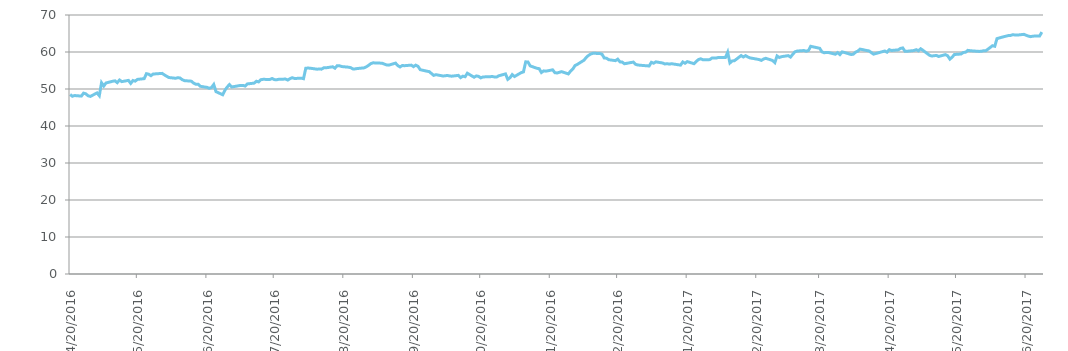
| Category | Series 0 |
|---|---|
| 06/27/2017 | 65.38 |
| 06/26/2017 | 64.35 |
| 06/23/2017 | 64.28 |
| 06/22/2017 | 64.15 |
| 06/21/2017 | 64.29 |
| 06/20/2017 | 64.52 |
| 06/19/2017 | 64.77 |
| 06/16/2017 | 64.57 |
| 06/15/2017 | 64.61 |
| 06/14/2017 | 64.67 |
| 06/13/2017 | 64.46 |
| 06/12/2017 | 64.43 |
| 06/09/2017 | 63.97 |
| 06/08/2017 | 63.79 |
| 06/07/2017 | 63.62 |
| 06/06/2017 | 61.55 |
| 06/05/2017 | 61.7 |
| 06/02/2017 | 60.32 |
| 06/01/2017 | 60.34 |
| 05/31/2017 | 60.19 |
| 05/30/2017 | 60.16 |
| 05/26/2017 | 60.35 |
| 05/25/2017 | 60.44 |
| 05/24/2017 | 59.94 |
| 05/23/2017 | 59.87 |
| 05/22/2017 | 59.46 |
| 05/19/2017 | 59.32 |
| 05/18/2017 | 58.59 |
| 05/17/2017 | 58.07 |
| 05/16/2017 | 59 |
| 05/15/2017 | 59.29 |
| 05/12/2017 | 58.79 |
| 05/11/2017 | 59.07 |
| 05/10/2017 | 59 |
| 05/09/2017 | 58.91 |
| 05/08/2017 | 59.09 |
| 05/05/2017 | 60.46 |
| 05/04/2017 | 60.87 |
| 05/03/2017 | 60.33 |
| 05/02/2017 | 60.62 |
| 05/01/2017 | 60.4 |
| 04/28/2017 | 60.2 |
| 04/27/2017 | 60.21 |
| 04/26/2017 | 61.1 |
| 04/25/2017 | 60.97 |
| 04/24/2017 | 60.58 |
| 04/21/2017 | 60.41 |
| 04/20/2017 | 60.63 |
| 04/19/2017 | 59.95 |
| 04/18/2017 | 60.27 |
| 04/17/2017 | 60.1 |
| 04/13/2017 | 59.42 |
| 04/12/2017 | 59.83 |
| 04/11/2017 | 60.29 |
| 04/10/2017 | 60.4 |
| 04/07/2017 | 60.78 |
| 04/06/2017 | 60.24 |
| 04/05/2017 | 59.97 |
| 04/04/2017 | 59.41 |
| 04/03/2017 | 59.32 |
| 03/31/2017 | 59.87 |
| 03/30/2017 | 60.03 |
| 03/29/2017 | 59.3 |
| 03/28/2017 | 59.83 |
| 03/27/2017 | 59.4 |
| 03/24/2017 | 59.85 |
| 03/23/2017 | 59.87 |
| 03/22/2017 | 59.8 |
| 03/21/2017 | 60.03 |
| 03/20/2017 | 61 |
| 03/17/2017 | 61.4 |
| 03/16/2017 | 61.55 |
| 03/15/2017 | 60.4 |
| 03/14/2017 | 60.21 |
| 03/13/2017 | 60.4 |
| 03/10/2017 | 60.26 |
| 03/09/2017 | 60.06 |
| 03/08/2017 | 59.39 |
| 03/07/2017 | 58.63 |
| 03/06/2017 | 59.02 |
| 03/03/2017 | 58.74 |
| 03/02/2017 | 58.52 |
| 03/01/2017 | 58.93 |
| 02/28/2017 | 57.13 |
| 02/27/2017 | 57.7 |
| 02/24/2017 | 58.3 |
| 02/23/2017 | 58.11 |
| 02/22/2017 | 57.73 |
| 02/21/2017 | 57.96 |
| 02/17/2017 | 58.4 |
| 02/16/2017 | 58.65 |
| 02/15/2017 | 59.01 |
| 02/14/2017 | 58.65 |
| 02/13/2017 | 59.03 |
| 02/10/2017 | 57.65 |
| 02/09/2017 | 57.58 |
| 02/08/2017 | 57.04 |
| 02/07/2017 | 59.93 |
| 02/06/2017 | 58.51 |
| 02/03/2017 | 58.54 |
| 02/02/2017 | 58.39 |
| 02/01/2017 | 58.35 |
| 01/31/2017 | 58.36 |
| 01/30/2017 | 57.94 |
| 01/27/2017 | 57.88 |
| 01/26/2017 | 58.17 |
| 01/25/2017 | 57.96 |
| 01/24/2017 | 57.46 |
| 01/23/2017 | 56.84 |
| 01/20/2017 | 57.4 |
| 01/19/2017 | 56.96 |
| 01/18/2017 | 57.31 |
| 01/17/2017 | 56.46 |
| 01/13/2017 | 56.83 |
| 01/12/2017 | 56.72 |
| 01/11/2017 | 56.84 |
| 01/10/2017 | 56.77 |
| 01/09/2017 | 57.02 |
| 01/06/2017 | 57.34 |
| 01/05/2017 | 56.97 |
| 01/04/2017 | 57.21 |
| 01/03/2017 | 56.22 |
| 12/30/2016 | 56.42 |
| 12/29/2016 | 56.49 |
| 12/28/2016 | 56.65 |
| 12/27/2016 | 57.28 |
| 12/23/2016 | 56.82 |
| 12/22/2016 | 57.28 |
| 12/21/2016 | 57.33 |
| 12/20/2016 | 58.07 |
| 12/19/2016 | 57.66 |
| 12/16/2016 | 57.92 |
| 12/15/2016 | 58.33 |
| 12/14/2016 | 58.37 |
| 12/13/2016 | 59.41 |
| 12/12/2016 | 59.59 |
| 12/09/2016 | 59.66 |
| 12/08/2016 | 59.46 |
| 12/07/2016 | 59.08 |
| 12/06/2016 | 58.56 |
| 12/05/2016 | 57.79 |
| 12/02/2016 | 56.65 |
| 12/01/2016 | 56.35 |
| 11/30/2016 | 55.4 |
| 11/29/2016 | 54.84 |
| 11/28/2016 | 54.08 |
| 11/25/2016 | 54.69 |
| 11/23/2016 | 54.33 |
| 11/22/2016 | 54.41 |
| 11/21/2016 | 55.18 |
| 11/18/2016 | 54.82 |
| 11/17/2016 | 54.9 |
| 11/16/2016 | 54.45 |
| 11/15/2016 | 55.5 |
| 11/14/2016 | 55.59 |
| 11/11/2016 | 56.25 |
| 11/10/2016 | 57.3 |
| 11/09/2016 | 57.34 |
| 11/08/2016 | 54.62 |
| 11/07/2016 | 54.43 |
| 11/04/2016 | 53.37 |
| 11/03/2016 | 53.894 |
| 11/02/2016 | 53.044 |
| 11/01/2016 | 52.61 |
| 10/31/2016 | 54.078 |
| 10/28/2016 | 53.566 |
| 10/27/2016 | 53.222 |
| 10/26/2016 | 53.264 |
| 10/25/2016 | 53.388 |
| 10/24/2016 | 53.308 |
| 10/21/2016 | 53.266 |
| 10/20/2016 | 53.006 |
| 10/19/2016 | 53.412 |
| 10/18/2016 | 53.53 |
| 10/17/2016 | 53.178 |
| 10/14/2016 | 54.258 |
| 10/13/2016 | 53.312 |
| 10/12/2016 | 53.466 |
| 10/11/2016 | 53.07 |
| 10/10/2016 | 53.68 |
| 10/07/2016 | 53.462 |
| 10/06/2016 | 53.544 |
| 10/05/2016 | 53.662 |
| 10/04/2016 | 53.552 |
| 10/03/2016 | 53.534 |
| 09/30/2016 | 53.872 |
| 09/29/2016 | 53.68 |
| 09/28/2016 | 54.192 |
| 09/27/2016 | 54.706 |
| 09/26/2016 | 54.808 |
| 09/23/2016 | 55.222 |
| 09/22/2016 | 56.144 |
| 09/21/2016 | 56.452 |
| 09/20/2016 | 56.042 |
| 09/19/2016 | 56.45 |
| 09/16/2016 | 56.3 |
| 09/15/2016 | 56.344 |
| 09/14/2016 | 55.96 |
| 09/13/2016 | 56.33 |
| 09/12/2016 | 56.998 |
| 09/09/2016 | 56.45 |
| 09/08/2016 | 56.506 |
| 09/07/2016 | 56.73 |
| 09/06/2016 | 56.972 |
| 09/02/2016 | 57.074 |
| 09/01/2016 | 56.87 |
| 08/31/2016 | 56.404 |
| 08/30/2016 | 55.992 |
| 08/29/2016 | 55.712 |
| 08/26/2016 | 55.536 |
| 08/25/2016 | 55.436 |
| 08/24/2016 | 55.428 |
| 08/23/2016 | 55.776 |
| 08/22/2016 | 55.898 |
| 08/19/2016 | 56.066 |
| 08/18/2016 | 56.272 |
| 08/17/2016 | 56.304 |
| 08/16/2016 | 55.622 |
| 08/15/2016 | 56.004 |
| 08/12/2016 | 55.728 |
| 08/11/2016 | 55.72 |
| 08/10/2016 | 55.366 |
| 08/09/2016 | 55.394 |
| 08/08/2016 | 55.36 |
| 08/05/2016 | 55.614 |
| 08/04/2016 | 55.668 |
| 08/03/2016 | 55.604 |
| 08/02/2016 | 52.786 |
| 08/01/2016 | 52.926 |
| 07/29/2016 | 52.84 |
| 07/28/2016 | 53.052 |
| 07/27/2016 | 52.808 |
| 07/26/2016 | 52.42 |
| 07/25/2016 | 52.682 |
| 07/22/2016 | 52.634 |
| 07/21/2016 | 52.488 |
| 07/20/2016 | 52.54 |
| 07/19/2016 | 52.834 |
| 07/18/2016 | 52.582 |
| 07/15/2016 | 52.61 |
| 07/14/2016 | 52.508 |
| 07/13/2016 | 51.916 |
| 07/12/2016 | 52.096 |
| 07/11/2016 | 51.588 |
| 07/08/2016 | 51.378 |
| 07/07/2016 | 50.792 |
| 07/06/2016 | 50.976 |
| 07/05/2016 | 50.974 |
| 07/01/2016 | 50.548 |
| 06/30/2016 | 51.192 |
| 06/29/2016 | 50.552 |
| 06/28/2016 | 49.666 |
| 06/27/2016 | 48.442 |
| 06/24/2016 | 49.28 |
| 06/23/2016 | 51.21 |
| 06/22/2016 | 50.4 |
| 06/21/2016 | 50.192 |
| 06/20/2016 | 50.44 |
| 06/17/2016 | 50.732 |
| 06/16/2016 | 51.312 |
| 06/15/2016 | 51.306 |
| 06/14/2016 | 51.604 |
| 06/13/2016 | 52.112 |
| 06/10/2016 | 52.258 |
| 06/09/2016 | 52.504 |
| 06/08/2016 | 52.964 |
| 06/07/2016 | 53.058 |
| 06/06/2016 | 52.9 |
| 06/03/2016 | 53.102 |
| 06/02/2016 | 53.448 |
| 06/01/2016 | 53.816 |
| 05/31/2016 | 54.224 |
| 05/27/2016 | 54.042 |
| 05/26/2016 | 53.6 |
| 05/25/2016 | 54 |
| 05/24/2016 | 54.138 |
| 05/23/2016 | 52.796 |
| 05/20/2016 | 52.598 |
| 05/19/2016 | 52.126 |
| 05/18/2016 | 52.292 |
| 05/17/2016 | 51.516 |
| 05/16/2016 | 52.322 |
| 05/13/2016 | 51.998 |
| 05/12/2016 | 52.428 |
| 05/11/2016 | 51.71 |
| 05/10/2016 | 52.204 |
| 05/09/2016 | 52.1 |
| 05/06/2016 | 51.632 |
| 05/05/2016 | 50.804 |
| 05/04/2016 | 51.698 |
| 05/03/2016 | 48.196 |
| 05/02/2016 | 48.936 |
| 04/29/2016 | 48.006 |
| 04/28/2016 | 48.172 |
| 04/27/2016 | 48.698 |
| 04/26/2016 | 48.876 |
| 04/25/2016 | 48.082 |
| 04/22/2016 | 48.23 |
| 04/21/2016 | 48.032 |
| 04/20/2016 | 48.52 |